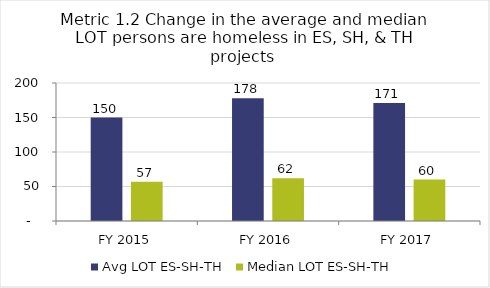
| Category | Avg LOT ES-SH-TH | Median LOT ES-SH-TH |
|---|---|---|
| FY 2015 | 150 | 57 |
| FY 2016 | 178 | 62 |
| FY 2017 | 171 | 60 |